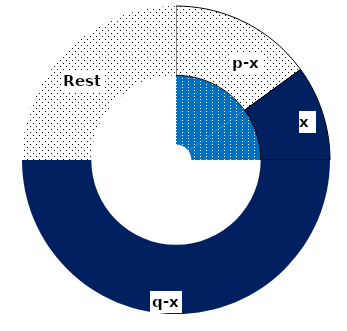
| Category | Series 0 | Series 1 |
|---|---|---|
| p-x | 0.15 | 0.15 |
| x | 0.1 | 0.1 |
| q-x | 0.5 | 0.5 |
| Rest | 0.25 | 0.25 |